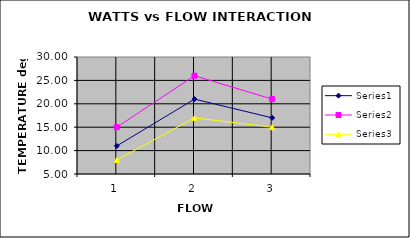
| Category | Series 0 | Series 1 | Series 2 |
|---|---|---|---|
| 0 | 11 | 15 | 8 |
| 1 | 21 | 26 | 17 |
| 2 | 17 | 21 | 15 |